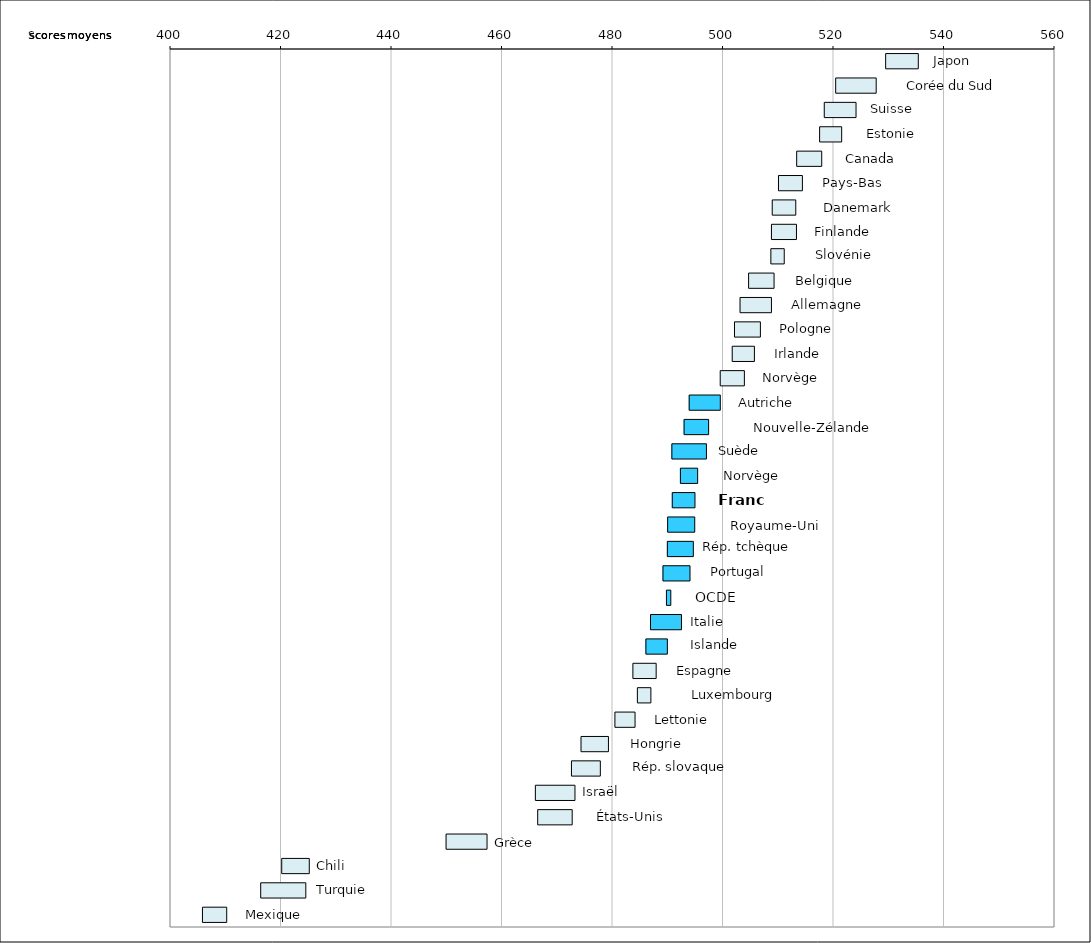
| Category | Series 0 | Series 1 | Series 2 |
|---|---|---|---|
| 1.Japon | 529.44 | 6 |  |
| 2.Corée | 520.394 | 7.425 |  |
| 3.Suisse | 518.33 | 5.841 |  |
| 4.Estonie | 517.487 | 4.085 |  |
| 5.Canada | 513.334 | 4.626 |  |
| 6.Pays-Bas | 510.041 | 4.423 |  |
| 7.Danemark | 508.913 | 4.348 |  |
| 8.Finlande | 508.768 | 4.619 |  |
| 9.Slovénie | 508.663 | 2.513 |  |
| 10.Belgique | 504.634 | 4.701 |  |
| 11.Allemagne | 503.083 | 5.776 |  |
| 12.Pologne | 502.079 | 4.78 |  |
| 13.Irlande | 501.669 | 4.106 |  |
| 14.Norvège | 499.498 | 4.463 |  |
| 15.Autriche | 493.881 | 5.722 |  |
| 16.Nouvelle-Zélande | 492.958 | 4.531 |  |
| 17.Suède | 490.746 | 6.345 |  |
| 18.Australie | 492.291 | 3.211 |  |
| 19.France | 490.822 | 4.198 |  |
| 20.Royaume-Uni | 489.982 | 4.993 |  |
| 21.Rép. tchèque | 489.929 | 4.792 |  |
| 22.Portugal | 489.136 | 4.982 |  |
| OCDE | 489.765 | 0.877 |  |
| 23.Italie | 486.883 | 5.691 |  |
| 24.Islande | 486.045 | 3.977 |  |
| 25.Espagne | 483.692 | 4.302 |  |
| 26.Luxembourg | 484.503 | 2.536 |  |
| 27.Lettonie | 480.436 | 3.737 |  |
| 28.Hongrie | 474.304 | 5.054 |  |
| 29.Rép. slovaque | 472.572 | 5.317 |  |
| 30.Israël | 466.04 | 7.258 |  |
| 31.États-Unis | 466.462 | 6.333 |  |
| 32.Grèce | 449.876 | 7.507 |  |
| 33.Chili | 420.132 | 5.079 |  |
| 34.Turquie | 416.325 | 8.258 |  |
| 35.Mexique | 405.783 | 4.482 |  |